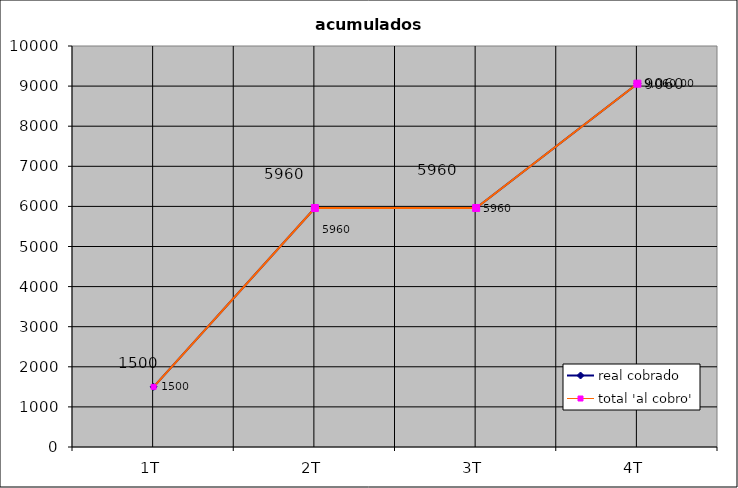
| Category | real cobrado | total 'al cobro' |
|---|---|---|
| 1T | 1500 | 1500 |
| 2T | 5960 | 5960 |
| 3T | 5960 | 5960 |
| 4T | 9060 | 9060 |